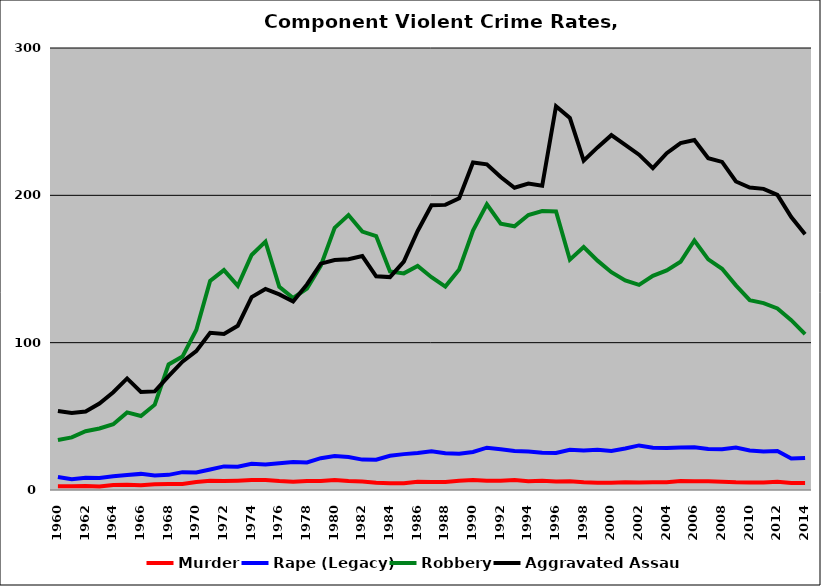
| Category | Murder | Rape (Legacy) | Robbery | Aggravated Assault |
|---|---|---|---|---|
| 1960.0 | 2.615 | 8.79 | 33.924 | 53.643 |
| 1961.0 | 2.599 | 7.333 | 35.699 | 52.232 |
| 1962.0 | 2.734 | 8.316 | 39.856 | 53.314 |
| 1963.0 | 2.346 | 8.141 | 41.763 | 58.727 |
| 1964.0 | 3.351 | 9.259 | 44.602 | 66.376 |
| 1965.0 | 3.568 | 10.252 | 52.682 | 75.72 |
| 1966.0 | 3.264 | 10.939 | 50.207 | 66.56 |
| 1967.0 | 3.852 | 9.923 | 57.916 | 66.919 |
| 1968.0 | 4.056 | 10.272 | 85.22 | 77.28 |
| 1969.0 | 4.135 | 12.116 | 90.57 | 87.088 |
| 1970.0 | 5.401 | 11.938 | 108.615 | 94.244 |
| 1971.0 | 6.213 | 13.915 | 141.872 | 106.684 |
| 1972.0 | 6.046 | 16.007 | 149.254 | 105.836 |
| 1973.0 | 6.335 | 15.754 | 138.615 | 111.494 |
| 1974.0 | 6.717 | 17.837 | 159.493 | 130.959 |
| 1975.0 | 6.832 | 17.35 | 168.555 | 136.45 |
| 1976.0 | 6.061 | 18.108 | 137.97 | 132.794 |
| 1977.0 | 5.558 | 18.973 | 130.301 | 127.968 |
| 1978.0 | 6.17 | 18.681 | 136.715 | 139.549 |
| 1979.0 | 6.172 | 21.592 | 152.204 | 153.619 |
| 1980.0 | 6.842 | 23.021 | 177.931 | 156.137 |
| 1981.0 | 6.145 | 22.438 | 186.59 | 156.575 |
| 1982.0 | 5.714 | 20.632 | 175.356 | 158.744 |
| 1983.0 | 4.901 | 20.588 | 172.35 | 145.011 |
| 1984.0 | 4.521 | 23.225 | 148.357 | 144.492 |
| 1985.0 | 4.64 | 24.348 | 147.043 | 155.024 |
| 1986.0 | 5.543 | 25.099 | 152.115 | 175.801 |
| 1987.0 | 5.379 | 26.223 | 144.445 | 193.314 |
| 1988.0 | 5.488 | 24.877 | 138.081 | 193.523 |
| 1989.0 | 6.254 | 24.61 | 149.709 | 198.048 |
| 1990.0 | 6.741 | 25.821 | 176.154 | 222.309 |
| 1991.0 | 6.337 | 28.718 | 193.888 | 221.052 |
| 1992.0 | 6.212 | 27.679 | 180.706 | 212.382 |
| 1993.0 | 6.831 | 26.519 | 178.976 | 205.129 |
| 1994.0 | 5.908 | 26.095 | 186.666 | 208.024 |
| 1995.0 | 6.254 | 25.232 | 189.347 | 206.486 |
| 1996.0 | 5.69 | 25.166 | 188.985 | 260.46 |
| 1997.0 | 5.865 | 27.363 | 156.306 | 252.562 |
| 1998.0 | 5.275 | 26.856 | 164.878 | 223.54 |
| 1999.0 | 4.936 | 27.339 | 155.661 | 232.533 |
| 2000.0 | 4.902 | 26.439 | 147.829 | 240.859 |
| 2001.0 | 5.291 | 28.18 | 142.241 | 234.201 |
| 2002.0 | 5.061 | 30.262 | 139.21 | 227.597 |
| 2003.0 | 5.23 | 28.745 | 145.343 | 218.475 |
| 2004.0 | 5.244 | 28.521 | 149.05 | 228.642 |
| 2005.0 | 6.094 | 28.907 | 154.885 | 235.423 |
| 2006.0 | 6.021 | 29.082 | 169.381 | 237.536 |
| 2007.0 | 5.912 | 27.814 | 156.578 | 225.235 |
| 2008.0 | 5.626 | 27.741 | 150.187 | 222.69 |
| 2009.0 | 5.268 | 28.767 | 138.868 | 209.397 |
| 2010.0 | 5.172 | 26.885 | 128.811 | 205.316 |
| 2011.0 | 5.014 | 26.201 | 126.845 | 204.379 |
| 2012.0 | 5.539 | 26.409 | 123.272 | 200.329 |
| 2013.0 | 4.78 | 21.344 | 115.317 | 185.271 |
| 2014.0 | 4.802 | 21.795 | 105.84 | 173.525 |